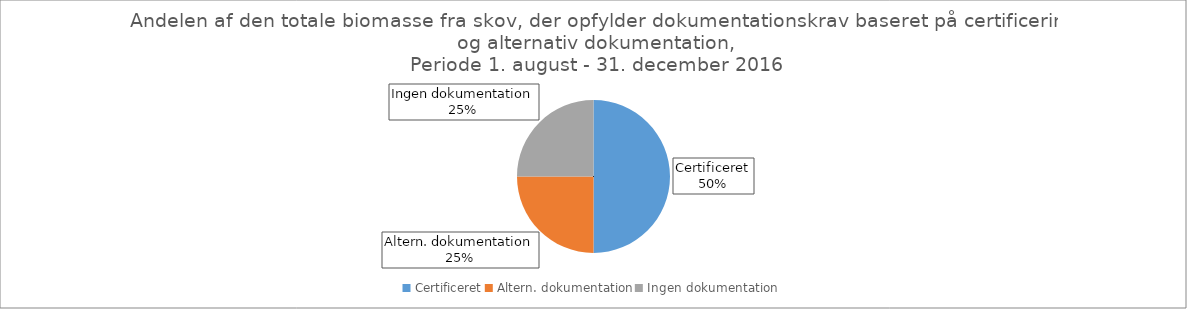
| Category | Series 1 |
|---|---|
| Certificeret | 1600 |
| Altern. dokumentation | 800 |
| Ingen dokumentation | 800 |